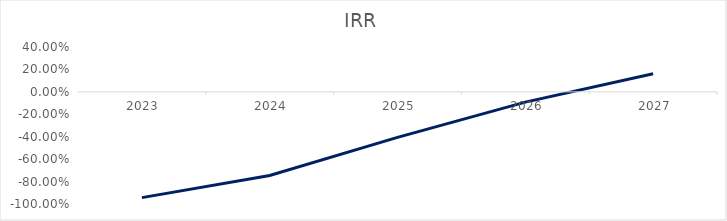
| Category | IRR |
|---|---|
| 2023-12-01 | -0.943 |
| 2024-12-01 | -0.746 |
| 2025-12-01 | -0.405 |
| 2026-12-01 | -0.092 |
| 2027-12-01 | 0.162 |